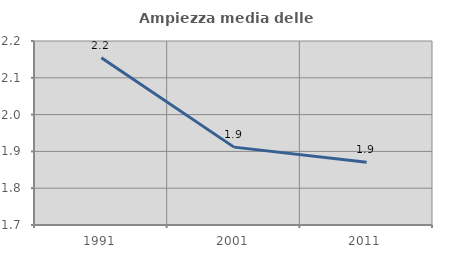
| Category | Ampiezza media delle famiglie |
|---|---|
| 1991.0 | 2.155 |
| 2001.0 | 1.912 |
| 2011.0 | 1.87 |